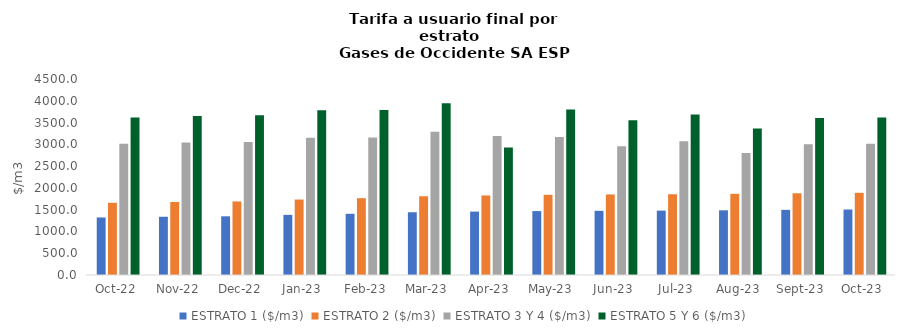
| Category | ESTRATO 1 ($/m3) | ESTRATO 2 ($/m3) | ESTRATO 3 Y 4 ($/m3) | ESTRATO 5 Y 6 ($/m3) |
|---|---|---|---|---|
| 2022-10-01 | 1321.29 | 1657.05 | 3013.74 | 3616.488 |
| 2022-11-01 | 1337.14 | 1675.76 | 3041.35 | 3649.62 |
| 2022-12-01 | 1347.43 | 1688.66 | 3054.71 | 3665.652 |
| 2023-01-01 | 1380.44 | 1732.41 | 3153.94 | 3784.728 |
| 2023-02-01 | 1405.01 | 1763.25 | 3155.49 | 3786.588 |
| 2023-03-01 | 1440.79 | 1807.57 | 3288.4 | 3946.08 |
| 2023-04-01 | 1455.91 | 1826.55 | 3194.1 | 2929.63 |
| 2023-05-01 | 1467.27 | 1840.8 | 3166.38 | 3799.656 |
| 2023-06-01 | 1473.58 | 1848.72 | 2958.7 | 3550.44 |
| 2023-07-01 | 1478 | 1854.26 | 3071.96 | 3686.352 |
| 2023-08-01 | 1485.39 | 1863.53 | 2800.92 | 3361.104 |
| 2023-09-01 | 1495.79 | 1876.58 | 3003.77 | 3604.524 |
| 2023-10-01 | 1503.86 | 1886.71 | 3011.88 | 3614.256 |